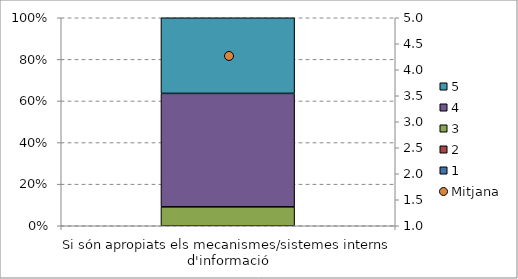
| Category | 1 | 2 | 3 | 4 | 5 |
|---|---|---|---|---|---|
| Si són apropiats els mecanismes/sistemes interns d'informació | 0 | 0 | 0.091 | 0.546 | 0.364 |